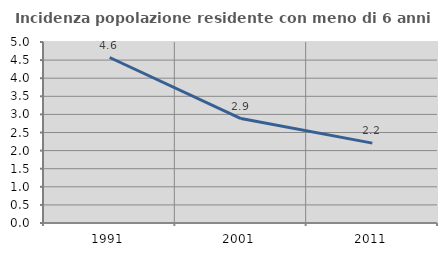
| Category | Incidenza popolazione residente con meno di 6 anni |
|---|---|
| 1991.0 | 4.571 |
| 2001.0 | 2.885 |
| 2011.0 | 2.206 |